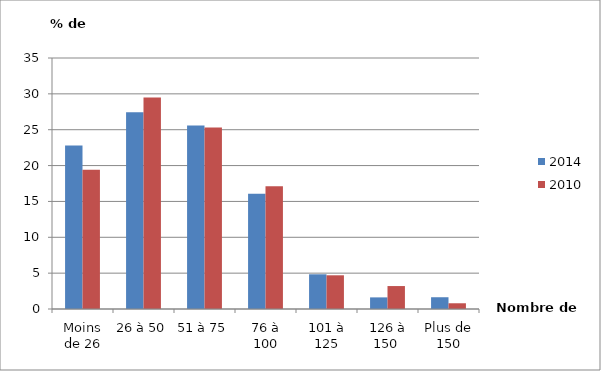
| Category | 2014 | 2010 |
|---|---|---|
| Moins de 26 | 22.81 | 19.4 |
| 26 à 50 | 27.42 | 29.5 |
| 51 à 75 | 25.59 | 25.3 |
| 76 à 100 | 16.07 | 17.1 |
| 101 à 125 | 4.84 | 4.7 |
| 126 à 150  | 1.62 | 3.2 |
| Plus de 150 | 1.64 | 0.8 |